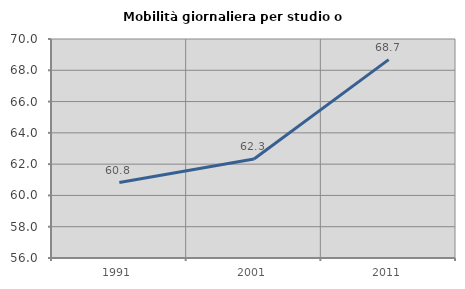
| Category | Mobilità giornaliera per studio o lavoro |
|---|---|
| 1991.0 | 60.824 |
| 2001.0 | 62.326 |
| 2011.0 | 68.684 |